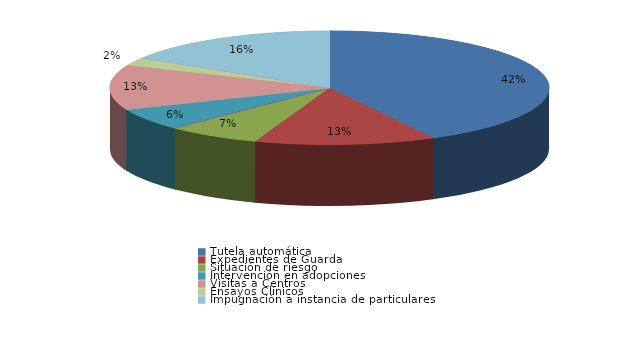
| Category | Series 0 |
|---|---|
| Tutela automática | 73 |
| Expedientes de Guarda | 23 |
| Situación de riesgo | 12 |
| Intervención en acogimientos | 0 |
| Intervención en adopciones | 11 |
| Defensa de los derechos fundamentales | 0 |
| Sustracción internacional de menores | 0 |
| Visitas a Centros | 22 |
| Ensayos Clínicos | 4 |
| Impugnación a instacia del Fiscal | 0 |
| Impugnación a instancia de particulares | 28 |